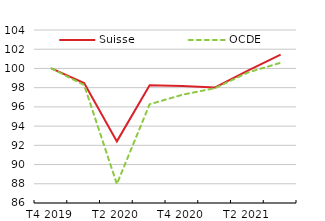
| Category | Suisse | OCDE |
|---|---|---|
| T4 2019 | 100 | 100 |
| T1 2020 | 98.474 | 98.277 |
| T2 2020 | 92.413 | 87.976 |
| T3 2020 | 98.251 | 96.27 |
| T4 2020 | 98.162 | 97.264 |
| T1 2021 | 98.024 | 97.952 |
| T2 2021 | 99.78 | 99.58 |